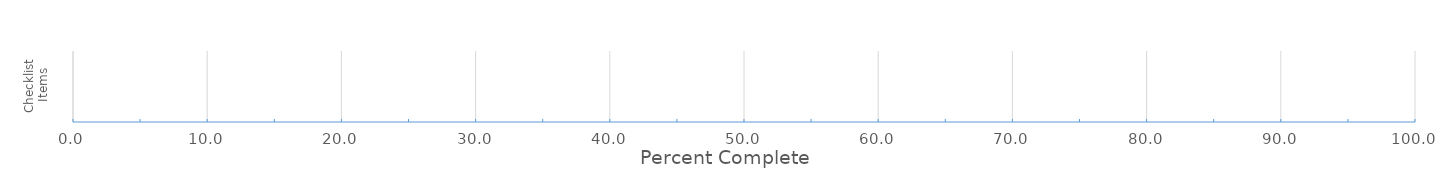
| Category | Percent Complete |
|---|---|
| 0 | 0 |